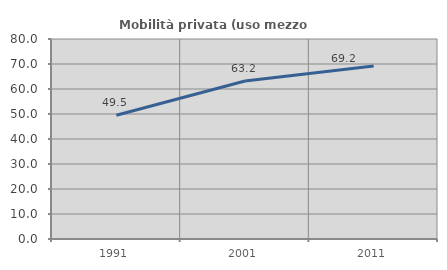
| Category | Mobilità privata (uso mezzo privato) |
|---|---|
| 1991.0 | 49.527 |
| 2001.0 | 63.202 |
| 2011.0 | 69.205 |